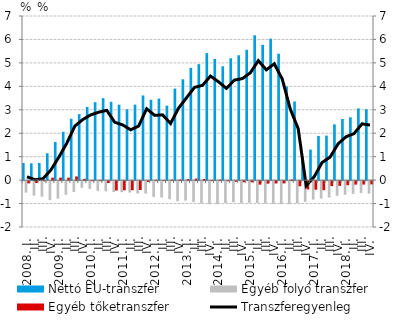
| Category | Nettó EU-transzfer | Egyéb folyó transzfer | Egyéb tőketranszfer |
|---|---|---|---|
| 2008. I. | 0.73 | -0.49 | -0.097 |
|          II. | 0.716 | -0.619 | -0.082 |
|          III. | 0.733 | -0.663 | -0.013 |
|          IV. | 1.144 | -0.813 | 0.103 |
| 2009. I. | 1.628 | -0.75 | 0.105 |
|          II. | 2.061 | -0.583 | 0.104 |
|          III. | 2.617 | -0.466 | 0.155 |
|          IV. | 2.814 | -0.284 | 0.054 |
| 2010. I. | 3.122 | -0.331 | -0.006 |
|          II. | 3.323 | -0.424 | -0.003 |
|          III. | 3.495 | -0.435 | -0.083 |
|          IV. | 3.338 | -0.468 | -0.402 |
| 2011. I. | 3.217 | -0.471 | -0.393 |
|          II. | 3.022 | -0.488 | -0.389 |
|          III. | 3.221 | -0.533 | -0.38 |
|          IV. | 3.612 | -0.534 | -0.034 |
| 2012. I. | 3.426 | -0.673 | 0.011 |
|          II. | 3.477 | -0.7 | 0.005 |
|          III. | 3.176 | -0.774 | 0.014 |
|          IV. | 3.904 | -0.86 | 0.026 |
| 2013. I. | 4.298 | -0.83 | 0.043 |
| II. | 4.789 | -0.898 | 0.066 |
|          III. | 4.947 | -0.956 | 0.051 |
| IV. | 5.419 | -0.986 | 0.006 |
| 2014. I. | 5.166 | -0.985 | 0.016 |
| II. | 4.854 | -0.935 | -0.007 |
|          III. | 5.197 | -0.902 | -0.028 |
| IV. | 5.324 | -0.947 | -0.048 |
| 2015. I. | 5.557 | -0.928 | -0.051 |
| II. | 6.178 | -0.931 | -0.151 |
|          III. | 5.77 | -0.958 | -0.108 |
| IV. | 6.032 | -0.969 | -0.1 |
| 2016. I. | 5.392 | -0.985 | -0.098 |
| II. | 3.99 | -0.982 | 0.028 |
|          III. | 3.353 | -0.941 | -0.219 |
| IV. | 1.004 | -0.887 | -0.356 |
| 2017. I. | 1.302 | -0.793 | -0.366 |
| II. | 1.885 | -0.745 | -0.385 |
|          III. | 1.898 | -0.704 | -0.212 |
| IV. | 2.378 | -0.626 | -0.203 |
| 2018. I. | 2.608 | -0.584 | -0.173 |
| II. | 2.68 | -0.546 | -0.15 |
|          III. | 3.058 | -0.511 | -0.147 |
| IV. | 3.021 | -0.534 | -0.14 |